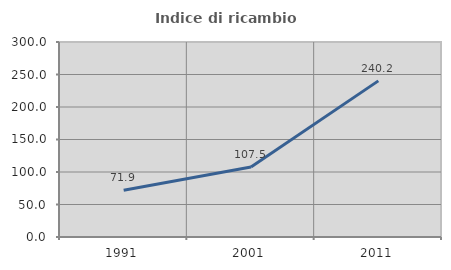
| Category | Indice di ricambio occupazionale  |
|---|---|
| 1991.0 | 71.914 |
| 2001.0 | 107.543 |
| 2011.0 | 240.185 |